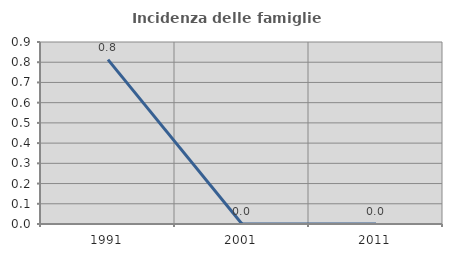
| Category | Incidenza delle famiglie numerose |
|---|---|
| 1991.0 | 0.813 |
| 2001.0 | 0 |
| 2011.0 | 0 |